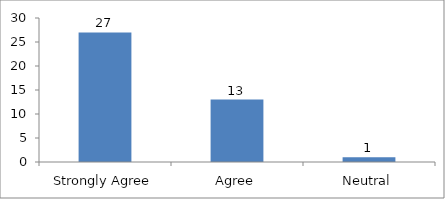
| Category | The speaker was knowledgeable about the topic? |
|---|---|
| Strongly Agree | 27 |
| Agree | 13 |
| Neutral | 1 |